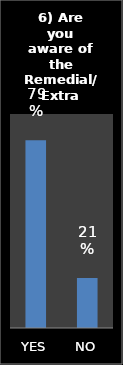
| Category | Series 0 |
|---|---|
| YES | 0.79 |
| NO | 0.21 |